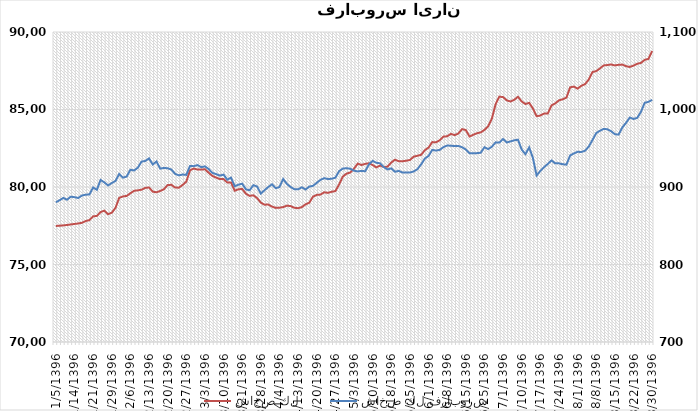
| Category | شاخص كل |
|---|---|
| 1396-01-05 | 77485.8 |
| 1396-01-06 | 77502.9 |
| 1396-01-07 | 77523.3 |
| 1396-01-08 | 77548.5 |
| 1396-01-09 | 77584.4 |
| 1396-01-14 | 77616.8 |
| 1396-01-15 | 77647.1 |
| 1396-01-16 | 77689.9 |
| 1396-01-19 | 77804.7 |
| 1396-01-20 | 77860.4 |
| 1396-01-21 | 78107.8 |
| 1396-01-23 | 78132.4 |
| 1396-01-26 | 78383.3 |
| 1396-01-27 | 78471.7 |
| 1396-01-28 | 78247.5 |
| 1396-01-29 | 78339.8 |
| 1396-01-30 | 78651.4 |
| 1396-02-02 | 79302.7 |
| 1396-02-03 | 79390.6 |
| 1396-02-04 | 79425.9 |
| 1396-02-06 | 79596.9 |
| 1396-02-09 | 79755.6 |
| 1396-02-10 | 79785 |
| 1396-02-11 | 79826.6 |
| 1396-02-12 | 79942.1 |
| 1396-02-13 | 79969.2 |
| 1396-02-16 | 79697.4 |
| 1396-02-17 | 79660.9 |
| 1396-02-18 | 79744.1 |
| 1396-02-19 | 79858.8 |
| 1396-02-20 | 80127.1 |
| 1396-02-23 | 80142 |
| 1396-02-24 | 79963 |
| 1396-02-25 | 79957.5 |
| 1396-02-26 | 80129.3 |
| 1396-02-27 | 80344.2 |
| 1396-02-30 | 81077.6 |
| 1396-02-31 | 81194 |
| 1396-03-01 | 81124.4 |
| 1396-03-02 | 81124.4 |
| 1396-03-03 | 81146.2 |
| 1396-03-06 | 80921.2 |
| 1396-03-07 | 80713.2 |
| 1396-03-08 | 80607.9 |
| 1396-03-09 | 80511.5 |
| 1396-03-10 | 80513.3 |
| 1396-03-13 | 80288.9 |
| 1396-03-16 | 80293.5 |
| 1396-03-17 | 79758.5 |
| 1396-03-20 | 79855.7 |
| 1396-03-21 | 79870.7 |
| 1396-03-22 | 79564.1 |
| 1396-03-23 | 79426.9 |
| 1396-03-24 | 79465.7 |
| 1396-03-27 | 79285 |
| 1396-03-28 | 78990.4 |
| 1396-03-29 | 78859.2 |
| 1396-03-30 | 78867.5 |
| 1396-03-31 | 78736.2 |
| 1396-04-03 | 78652.7 |
| 1396-04-04 | 78665.5 |
| 1396-04-07 | 78704.5 |
| 1396-04-10 | 78799.7 |
| 1396-04-11 | 78765.3 |
| 1396-04-12 | 78659.2 |
| 1396-04-13 | 78632.5 |
| 1396-04-14 | 78700.2 |
| 1396-04-17 | 78881.6 |
| 1396-04-18 | 78985.4 |
| 1396-04-19 | 79377 |
| 1396-04-20 | 79490.4 |
| 1396-04-21 | 79509.6 |
| 1396-04-24 | 79658.9 |
| 1396-04-25 | 79620.8 |
| 1396-04-26 | 79692.9 |
| 1396-04-27 | 79735.7 |
| 1396-04-28 | 80162.5 |
| 1396-04-31 | 80670.8 |
| 1396-05-01 | 80863 |
| 1396-05-02 | 80933.9 |
| 1396-05-03 | 81181.7 |
| 1396-05-04 | 81509.3 |
| 1396-05-07 | 81420.9 |
| 1396-05-08 | 81491.4 |
| 1396-05-09 | 81533.5 |
| 1396-05-10 | 81415.9 |
| 1396-05-11 | 81265.9 |
| 1396-05-15 | 81384.1 |
| 1396-05-16 | 81285.7 |
| 1396-05-17 | 81313.9 |
| 1396-05-18 | 81579.3 |
| 1396-05-21 | 81763.1 |
| 1396-05-22 | 81661.5 |
| 1396-05-23 | 81659.3 |
| 1396-05-24 | 81696.3 |
| 1396-05-25 | 81741.9 |
| 1396-05-28 | 81954.9 |
| 1396-05-29 | 82016.2 |
| 1396-05-30 | 82075 |
| 1396-05-31 | 82372.4 |
| 1396-06-01 | 82541.8 |
| 1396-06-04 | 82897.1 |
| 1396-06-05 | 82885 |
| 1396-06-06 | 83012.1 |
| 1396-06-07 | 83252 |
| 1396-06-08 | 83272.9 |
| 1396-06-11 | 83428.2 |
| 1396-06-12 | 83345.2 |
| 1396-06-13 | 83452.1 |
| 1396-06-14 | 83733.5 |
| 1396-06-15 | 83675.3 |
| 1396-06-19 | 83255.7 |
| 1396-06-20 | 83369.1 |
| 1396-06-21 | 83469.2 |
| 1396-06-22 | 83523.8 |
| 1396-06-25 | 83683.2 |
| 1396-06-26 | 83916.6 |
| 1396-06-27 | 84414.5 |
| 1396-06-28 | 85343.9 |
| 1396-06-29 | 85831.8 |
| 1396-07-01 | 85798.4 |
| 1396-07-02 | 85588.8 |
| 1396-07-03 | 85516.9 |
| 1396-07-04 | 85628.8 |
| 1396-07-05 | 85819 |
| 1396-07-10 | 85514.9 |
| 1396-07-11 | 85355 |
| 1396-07-12 | 85429.5 |
| 1396-07-15 | 85069.5 |
| 1396-07-16 | 84564.9 |
| 1396-07-17 | 84611.6 |
| 1396-07-18 | 84734.4 |
| 1396-07-19 | 84744.1 |
| 1396-07-22 | 85263.6 |
| 1396-07-23 | 85394.9 |
| 1396-07-24 | 85590.7 |
| 1396-07-25 | 85660 |
| 1396-07-26 | 85768 |
| 1396-07-29 | 86430.5 |
| 1396-07-30 | 86480.2 |
| 1396-08-01 | 86346.2 |
| 1396-08-02 | 86529.2 |
| 1396-08-03 | 86636.8 |
| 1396-08-06 | 86935.4 |
| 1396-08-07 | 87416.6 |
| 1396-08-08 | 87477.2 |
| 1396-08-09 | 87649.9 |
| 1396-08-10 | 87844.9 |
| 1396-08-13 | 87868.6 |
| 1396-08-14 | 87905.1 |
| 1396-08-15 | 87843.7 |
| 1396-08-16 | 87883.1 |
| 1396-08-17 | 87897.4 |
| 1396-08-20 | 87795.2 |
| 1396-08-21 | 87744.7 |
| 1396-08-22 | 87832.5 |
| 1396-08-23 | 87949.8 |
| 1396-08-24 | 88005.9 |
| 1396-08-27 | 88202.3 |
| 1396-08-29 | 88261.2 |
| 1396-08-30 | 88774.6 |